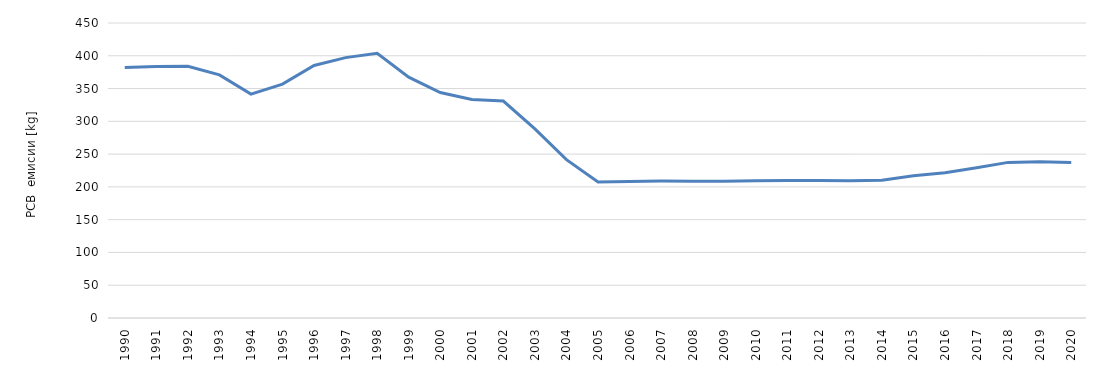
| Category | Series 0 |
|---|---|
| 1990 | 382.128 |
| 1991 | 383.548 |
| 1992 | 383.848 |
| 1993 | 370.805 |
| 1994 | 341.565 |
| 1995 | 356.737 |
| 1996 | 385.17 |
| 1997 | 397.207 |
| 1998 | 403.922 |
| 1999 | 367.448 |
| 2000 | 343.987 |
| 2001 | 333.256 |
| 2002 | 330.977 |
| 2003 | 288.377 |
| 2004 | 241.585 |
| 2005 | 207.528 |
| 2006 | 208.297 |
| 2007 | 208.903 |
| 2008 | 208.509 |
| 2009 | 208.549 |
| 2010 | 209.329 |
| 2011 | 209.734 |
| 2012 | 209.569 |
| 2013 | 209.383 |
| 2014 | 210.032 |
| 2015 | 216.913 |
| 2016 | 221.418 |
| 2017 | 229.158 |
| 2018 | 237.369 |
| 2019 | 238.451 |
| 2020 | 237.24 |